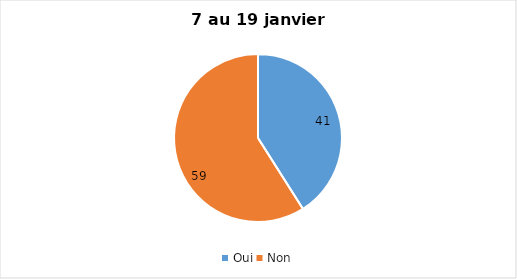
| Category | 7 au 19 janvier 2022 |
|---|---|
| Oui | 41 |
| Non | 59 |